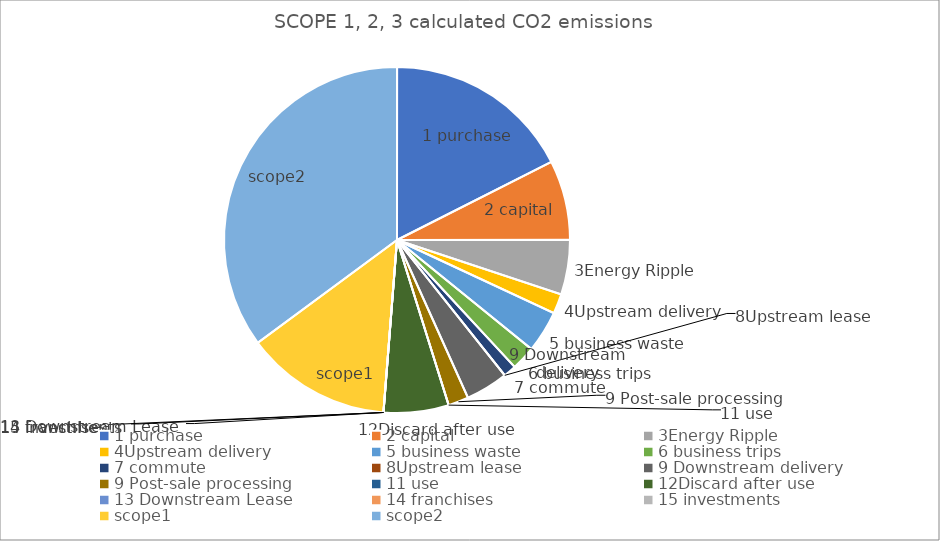
| Category | Series 0 |
|---|---|
| 1 purchase | 73.832 |
| 2 capital | 31.305 |
| 3Energy Ripple | 21.456 |
| 4Upstream delivery | 7.788 |
| 5 business waste | 16.454 |
| 6 business trips | 9.49 |
| 7 commute | 5.01 |
| 8Upstream lease | 0 |
| 9 Downstream delivery | 16.727 |
| 9 Post-sale processing | 7.996 |
| 11 use | 0 |
| 12Discard after use | 25.534 |
| 13 Downstream Lease | 0 |
| 14 franchises | 0 |
| 15 investments | 0 |
| scope1 | 57.327 |
| scope2 | 147.826 |